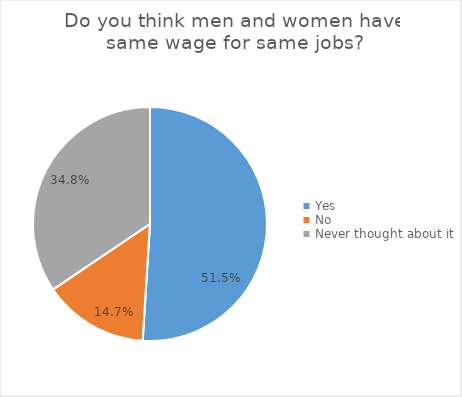
| Category | Series 0 |
|---|---|
| Yes | 0.515 |
| No | 0.147 |
| Never thought about it | 0.348 |